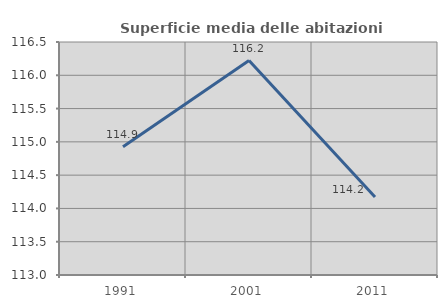
| Category | Superficie media delle abitazioni occupate |
|---|---|
| 1991.0 | 114.925 |
| 2001.0 | 116.222 |
| 2011.0 | 114.172 |